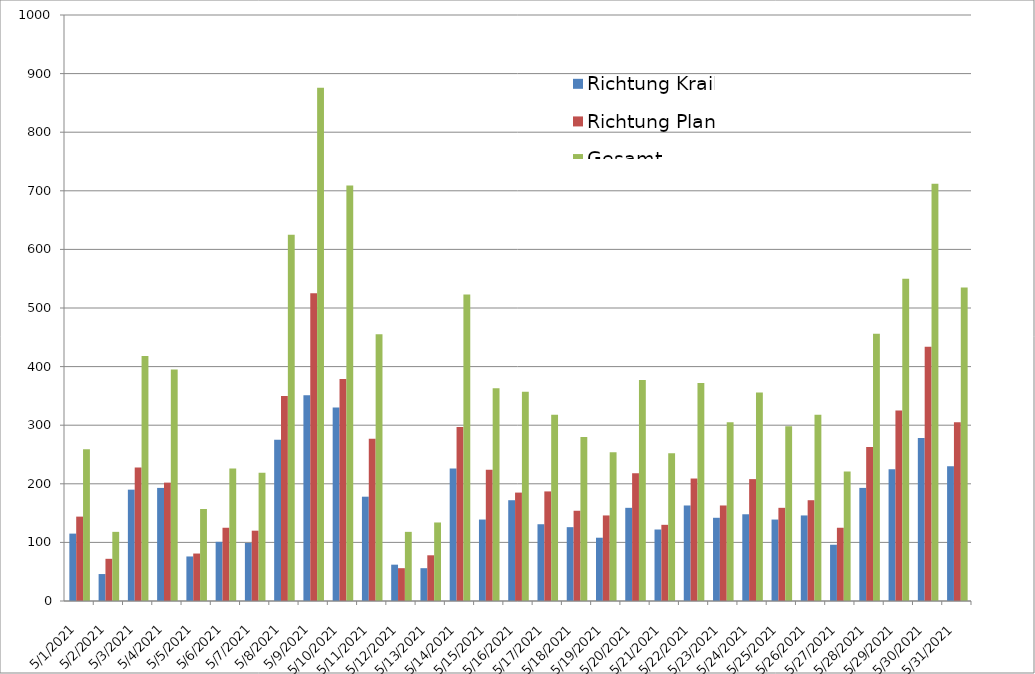
| Category | Richtung Krailling | Richtung Planegg | Gesamt |
|---|---|---|---|
| 5/1/21 | 115 | 144 | 259 |
| 5/2/21 | 46 | 72 | 118 |
| 5/3/21 | 190 | 228 | 418 |
| 5/4/21 | 193 | 202 | 395 |
| 5/5/21 | 76 | 81 | 157 |
| 5/6/21 | 101 | 125 | 226 |
| 5/7/21 | 99 | 120 | 219 |
| 5/8/21 | 275 | 350 | 625 |
| 5/9/21 | 351 | 525 | 876 |
| 5/10/21 | 330 | 379 | 709 |
| 5/11/21 | 178 | 277 | 455 |
| 5/12/21 | 62 | 56 | 118 |
| 5/13/21 | 56 | 78 | 134 |
| 5/14/21 | 226 | 297 | 523 |
| 5/15/21 | 139 | 224 | 363 |
| 5/16/21 | 172 | 185 | 357 |
| 5/17/21 | 131 | 187 | 318 |
| 5/18/21 | 126 | 154 | 280 |
| 5/19/21 | 108 | 146 | 254 |
| 5/20/21 | 159 | 218 | 377 |
| 5/21/21 | 122 | 130 | 252 |
| 5/22/21 | 163 | 209 | 372 |
| 5/23/21 | 142 | 163 | 305 |
| 5/24/21 | 148 | 208 | 356 |
| 5/25/21 | 139 | 159 | 298 |
| 5/26/21 | 146 | 172 | 318 |
| 5/27/21 | 96 | 125 | 221 |
| 5/28/21 | 193 | 263 | 456 |
| 5/29/21 | 225 | 325 | 550 |
| 5/30/21 | 278 | 434 | 712 |
| 5/31/21 | 230 | 305 | 535 |